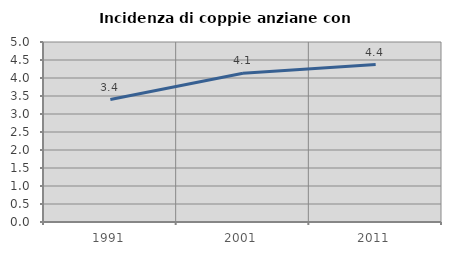
| Category | Incidenza di coppie anziane con figli |
|---|---|
| 1991.0 | 3.402 |
| 2001.0 | 4.133 |
| 2011.0 | 4.373 |